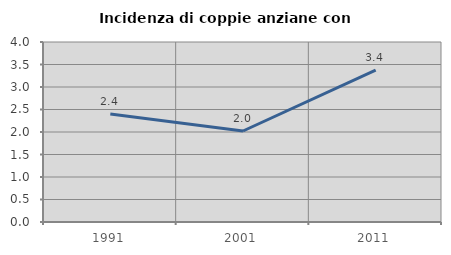
| Category | Incidenza di coppie anziane con figli |
|---|---|
| 1991.0 | 2.398 |
| 2001.0 | 2.022 |
| 2011.0 | 3.376 |